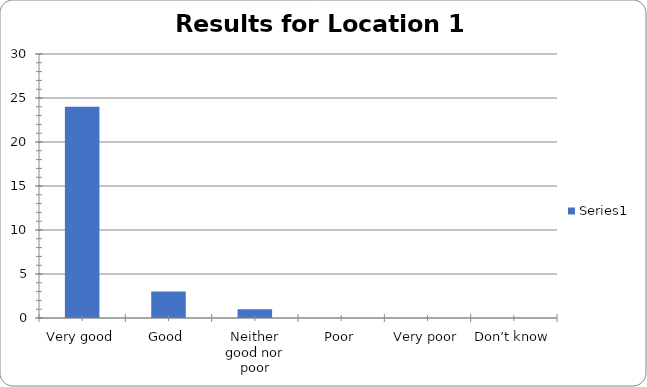
| Category | Series 0 |
|---|---|
| Very good | 24 |
| Good | 3 |
| Neither good nor poor | 1 |
| Poor | 0 |
| Very poor | 0 |
| Don’t know | 0 |